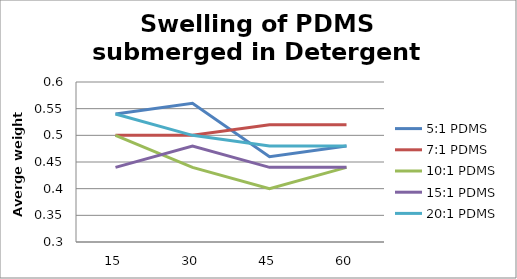
| Category | 5:1 PDMS | 7:1 PDMS | 10:1 PDMS | 15:1 PDMS | 20:1 PDMS |
|---|---|---|---|---|---|
| 0 | 0.54 | 0.5 | 0.5 | 0.44 | 0.54 |
| 1 | 0.56 | 0.5 | 0.44 | 0.48 | 0.5 |
| 2 | 0.46 | 0.52 | 0.4 | 0.44 | 0.48 |
| 3 | 0.48 | 0.52 | 0.44 | 0.44 | 0.48 |